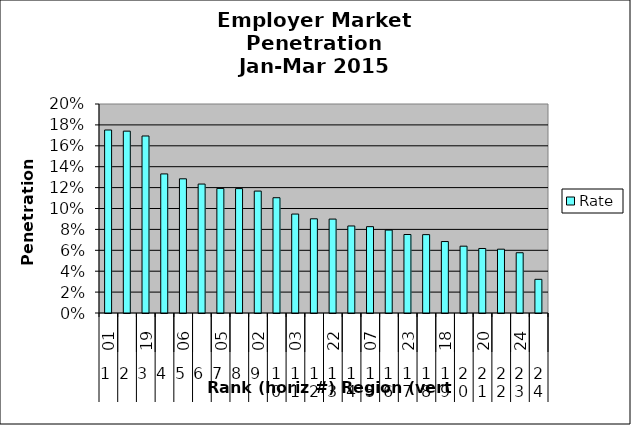
| Category | Rate |
|---|---|
| 0 | 0.175 |
| 1 | 0.174 |
| 2 | 0.169 |
| 3 | 0.133 |
| 4 | 0.128 |
| 5 | 0.123 |
| 6 | 0.119 |
| 7 | 0.119 |
| 8 | 0.117 |
| 9 | 0.11 |
| 10 | 0.095 |
| 11 | 0.09 |
| 12 | 0.09 |
| 13 | 0.083 |
| 14 | 0.083 |
| 15 | 0.079 |
| 16 | 0.075 |
| 17 | 0.075 |
| 18 | 0.068 |
| 19 | 0.064 |
| 20 | 0.062 |
| 21 | 0.061 |
| 22 | 0.058 |
| 23 | 0.032 |